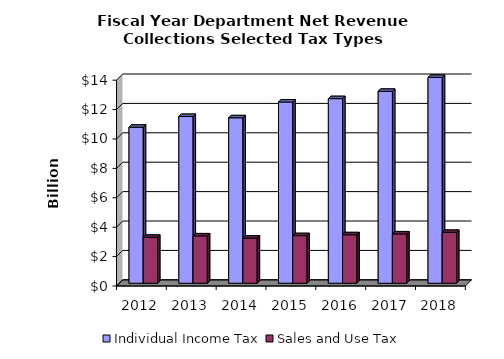
| Category | Individual Income Tax | Sales and Use Tax |
|---|---|---|
| 2012.0 | 10.613 | 3.122 |
| 2013.0 | 11.34 | 3.22 |
| 2014.0 | 11.253 | 3.066 |
| 2015.0 | 12.329 | 3.235 |
| 2016.0 | 12.556 | 3.296 |
| 2017.0 | 13.053 | 3.355 |
| 2018.0 | 14.106 | 3.458 |